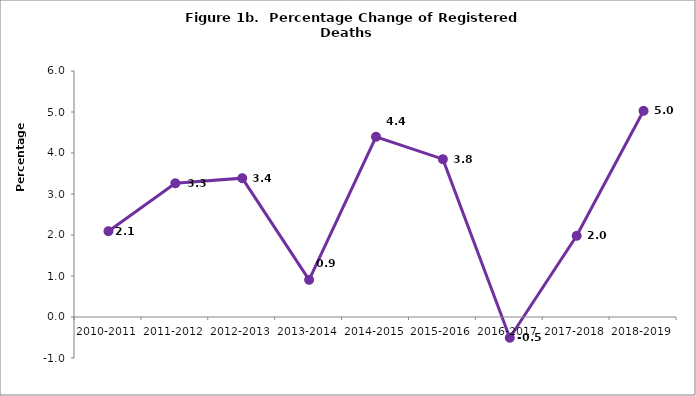
| Category | Percent Change |
|---|---|
| 2010-2011 | 2.093 |
| 2011-2012 | 3.262 |
| 2012-2013 | 3.386 |
| 2013-2014 | 0.906 |
| 2014-2015 | 4.396 |
| 2015-2016 | 3.849 |
| 2016-2017 | -0.506 |
| 2017-2018 | 1.981 |
| 2018-2019 | 5.029 |